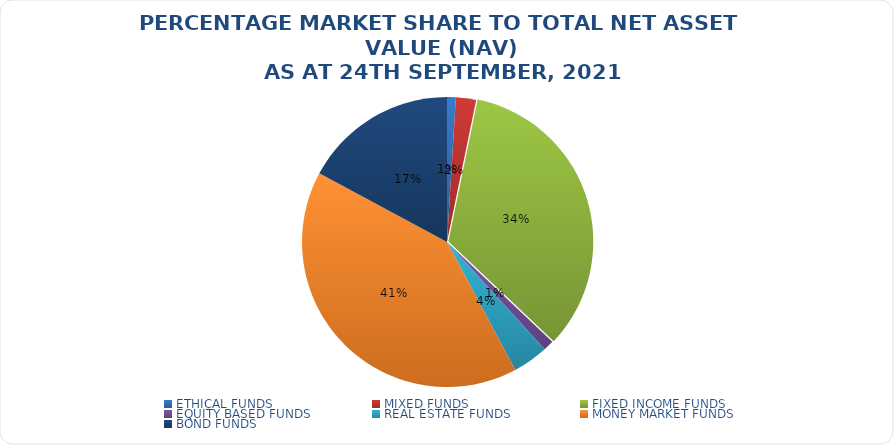
| Category | NET ASSET VALUE |
|---|---|
| ETHICAL FUNDS | 12583775566.311 |
| MIXED FUNDS | 28843373549.965 |
| FIXED INCOME FUNDS | 434544424091.985 |
| EQUITY BASED FUNDS | 15159892439.63 |
| REAL ESTATE FUNDS | 50823216201.2 |
| MONEY MARKET FUNDS | 522133802446.933 |
| BOND FUNDS | 220169083598.278 |